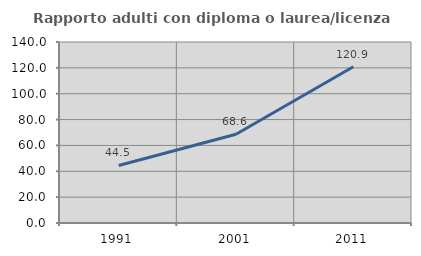
| Category | Rapporto adulti con diploma o laurea/licenza media  |
|---|---|
| 1991.0 | 44.523 |
| 2001.0 | 68.638 |
| 2011.0 | 120.891 |